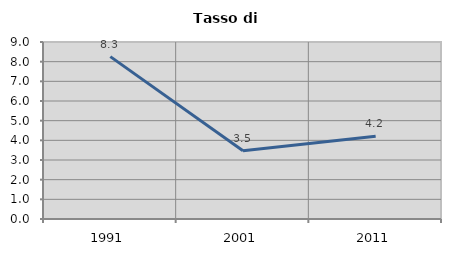
| Category | Tasso di disoccupazione   |
|---|---|
| 1991.0 | 8.255 |
| 2001.0 | 3.474 |
| 2011.0 | 4.212 |